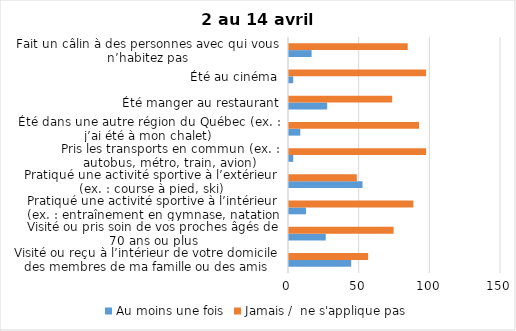
| Category | Au moins une fois | Jamais /  ne s'applique pas |
|---|---|---|
| Visité ou reçu à l’intérieur de votre domicile des membres de ma famille ou des amis | 44 | 56 |
| Visité ou pris soin de vos proches âgés de 70 ans ou plus | 26 | 74 |
| Pratiqué une activité sportive à l’intérieur (ex. : entraînement en gymnase, natation en piscine) | 12 | 88 |
| Pratiqué une activité sportive à l’extérieur (ex. : course à pied, ski) | 52 | 48 |
| Pris les transports en commun (ex. : autobus, métro, train, avion) | 3 | 97 |
| Été dans une autre région du Québec (ex. : j’ai été à mon chalet) | 8 | 92 |
| Été manger au restaurant | 27 | 73 |
| Été au cinéma | 3 | 97 |
| Fait un câlin à des personnes avec qui vous n’habitez pas | 16 | 84 |